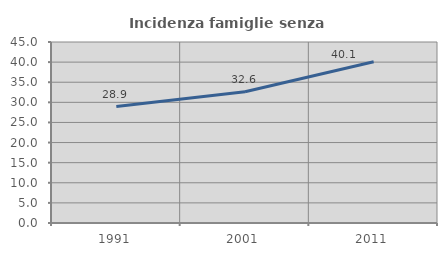
| Category | Incidenza famiglie senza nuclei |
|---|---|
| 1991.0 | 28.936 |
| 2001.0 | 32.621 |
| 2011.0 | 40.07 |